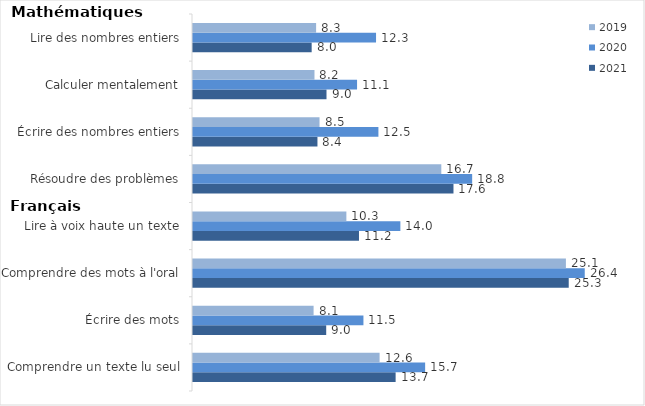
| Category | 2021 | 2020 | 2019 |
|---|---|---|---|
| Comprendre un texte lu seul | 13.66 | 15.65 | 12.58 |
| Écrire des mots | 8.98 | 11.49 | 8.13 |
| Comprendre des mots à l'oral | 25.33 | 26.41 | 25.14 |
| Lire à voix haute un texte | 11.19 | 13.98 | 10.34 |
| Résoudre des problèmes | 17.56 | 18.82 | 16.74 |
| Écrire des nombres entiers | 8.39 | 12.5 | 8.53 |
| Calculer mentalement | 9 | 11.06 | 8.19 |
| Lire des nombres entiers | 8 | 12.34 | 8.3 |